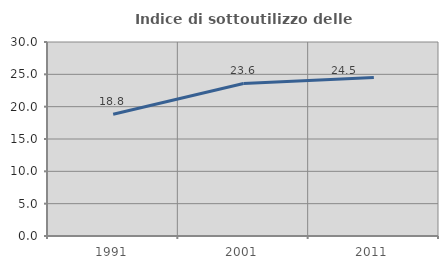
| Category | Indice di sottoutilizzo delle abitazioni  |
|---|---|
| 1991.0 | 18.823 |
| 2001.0 | 23.587 |
| 2011.0 | 24.514 |